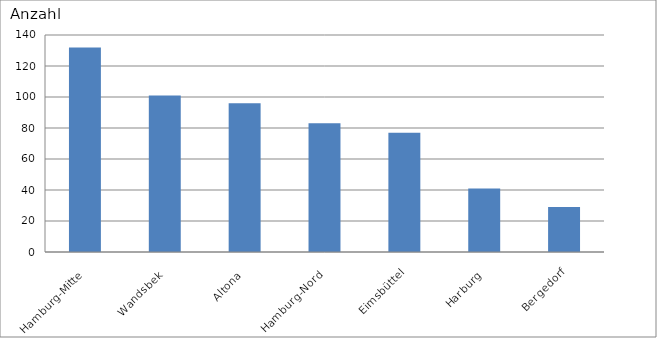
| Category | Hamburg-Mitte Wandsbek Altona Hamburg-Nord Eimsbüttel Harburg Bergedorf |
|---|---|
| Hamburg-Mitte | 132 |
| Wandsbek | 101 |
| Altona | 96 |
| Hamburg-Nord | 83 |
| Eimsbüttel | 77 |
| Harburg | 41 |
| Bergedorf | 29 |